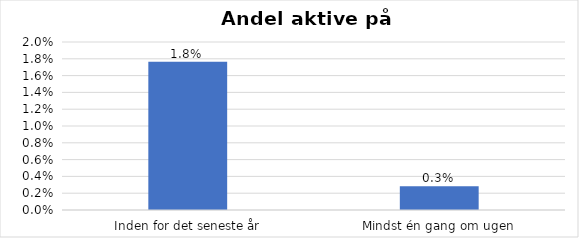
| Category | % |
|---|---|
| Inden for det seneste år | 0.018 |
| Mindst én gang om ugen | 0.003 |